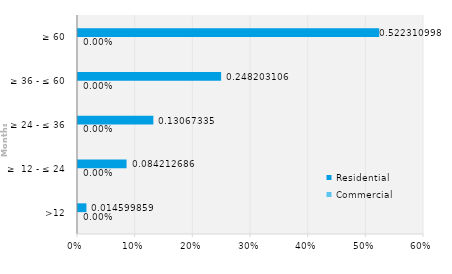
| Category | Commercial | Residential |
|---|---|---|
| >12 | 0 | 0.015 |
| ≥  12 - ≤ 24 | 0 | 0.084 |
| ≥ 24 - ≤ 36 | 0 | 0.131 |
| ≥ 36 - ≤ 60 | 0 | 0.248 |
| ≥ 60 | 0 | 0.522 |